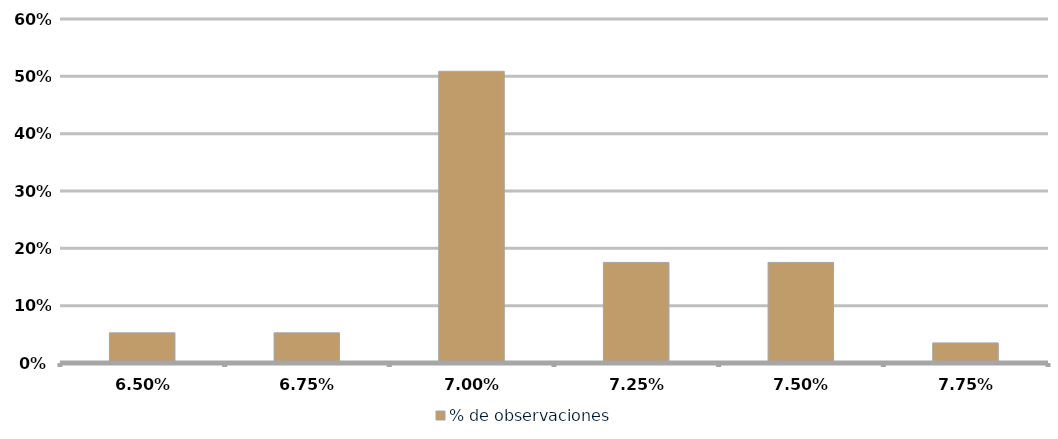
| Category | % de observaciones  |
|---|---|
| 0.065 | 0.053 |
| 0.0675 | 0.053 |
| 0.07 | 0.509 |
| 0.07250000000000001 | 0.175 |
| 0.07500000000000001 | 0.175 |
| 0.07750000000000001 | 0.035 |